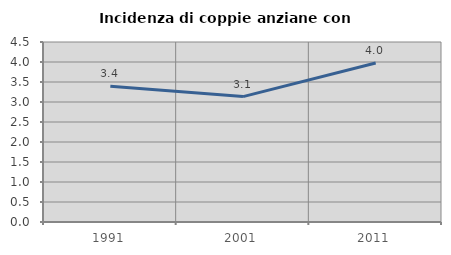
| Category | Incidenza di coppie anziane con figli |
|---|---|
| 1991.0 | 3.393 |
| 2001.0 | 3.135 |
| 2011.0 | 3.976 |